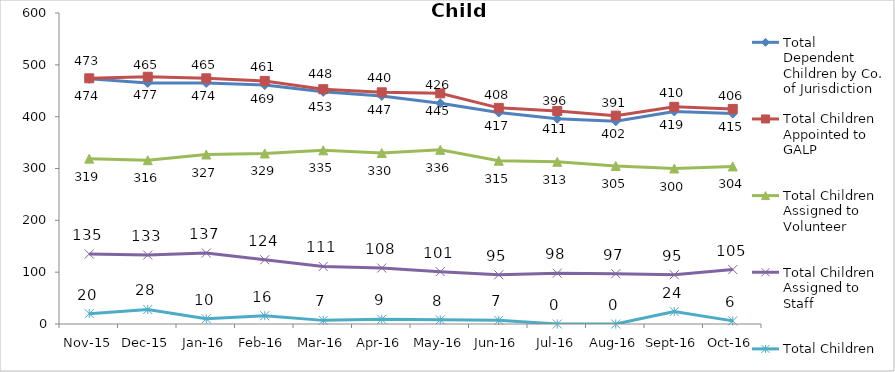
| Category | Total Dependent Children by Co. of Jurisdiction | Total Children Appointed to GALP | Total Children Assigned to Volunteer | Total Children Assigned to Staff | Total Children Unassigned |
|---|---|---|---|---|---|
| Nov-15 | 473 | 474 | 319 | 135 | 20 |
| Dec-15 | 465 | 477 | 316 | 133 | 28 |
| Jan-16 | 465 | 474 | 327 | 137 | 10 |
| Feb-16 | 461 | 469 | 329 | 124 | 16 |
| Mar-16 | 448 | 453 | 335 | 111 | 7 |
| Apr-16 | 440 | 447 | 330 | 108 | 9 |
| May-16 | 426 | 445 | 336 | 101 | 8 |
| Jun-16 | 408 | 417 | 315 | 95 | 7 |
| Jul-16 | 396 | 411 | 313 | 98 | 0 |
| Aug-16 | 391 | 402 | 305 | 97 | 0 |
| Sep-16 | 410 | 419 | 300 | 95 | 24 |
| Oct-16 | 406 | 415 | 304 | 105 | 6 |